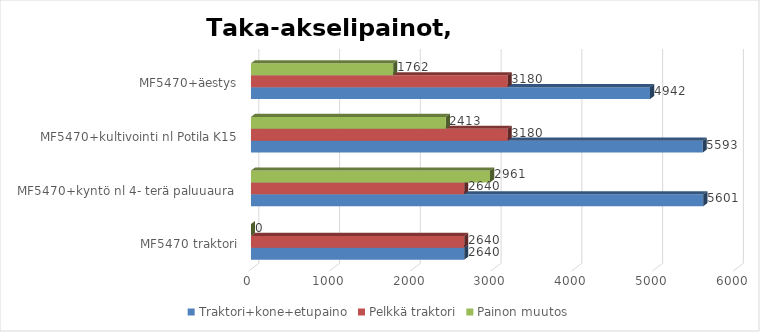
| Category | Traktori+kone+etupaino | Pelkkä traktori | Painon muutos |
|---|---|---|---|
| MF5470 traktori | 2640 | 2640 | 0 |
| MF5470+kyntö nl 4- terä paluuaura  | 5601.161 | 2640 | 2961.161 |
| MF5470+kultivointi nl Potila K15 | 5593.483 | 3180 | 2413.483 |
| MF5470+äestys | 4941.798 | 3180 | 1761.798 |